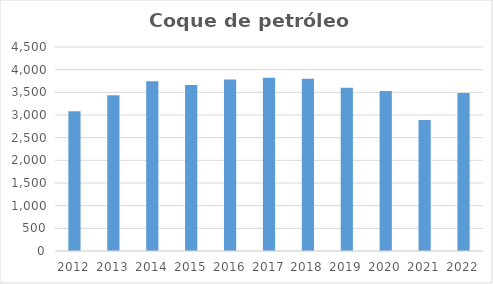
| Category | Coque de petróleo |
|---|---|
| 2012.0 | 3085.022 |
| 2013.0 | 3436.29 |
| 2014.0 | 3743.635 |
| 2015.0 | 3659.797 |
| 2016.0 | 3781.5 |
| 2017.0 | 3823.313 |
| 2018.0 | 3802.147 |
| 2019.0 | 3602.969 |
| 2020.0 | 3528.891 |
| 2021.0 | 2887.147 |
| 2022.0 | 3484.034 |